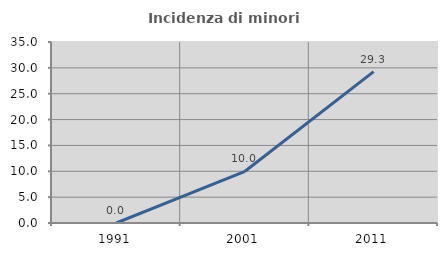
| Category | Incidenza di minori stranieri |
|---|---|
| 1991.0 | 0 |
| 2001.0 | 10 |
| 2011.0 | 29.268 |